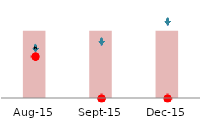
| Category | Series 1 |
|---|---|
| 2015-08-01 | 560.924 |
| 2015-09-01 | 560.924 |
| 2015-12-01 | 560.924 |